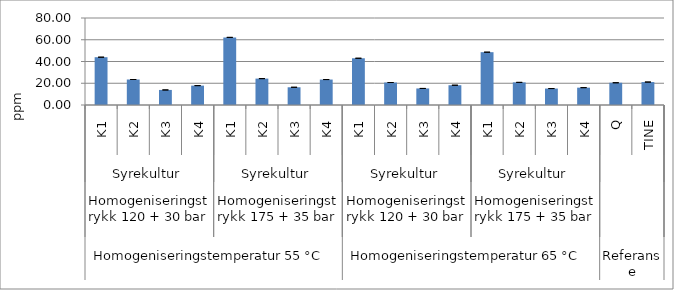
| Category | Etanol |
|---|---|
| 0 | 43.955 |
| 1 | 23.446 |
| 2 | 13.848 |
| 3 | 17.83 |
| 4 | 62.181 |
| 5 | 24.266 |
| 6 | 16.301 |
| 7 | 23.404 |
| 8 | 42.977 |
| 9 | 20.681 |
| 10 | 15.222 |
| 11 | 18.188 |
| 12 | 48.571 |
| 13 | 20.798 |
| 14 | 15.122 |
| 15 | 15.951 |
| 16 | 20.457 |
| 17 | 21.103 |